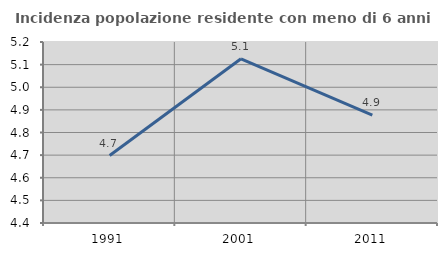
| Category | Incidenza popolazione residente con meno di 6 anni |
|---|---|
| 1991.0 | 4.698 |
| 2001.0 | 5.126 |
| 2011.0 | 4.877 |